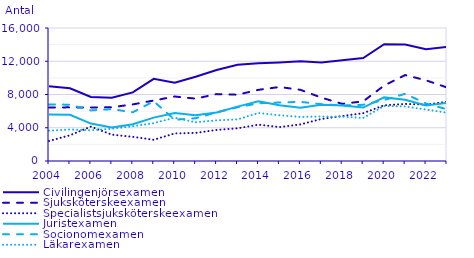
| Category | Civilingenjörsexamen                               | Sjuksköterskeexamen                                | Specialistsjuksköterskeexamen                      | Juristexamen                                       | Socionomexamen                                     | Läkarexamen                                        |
|---|---|---|---|---|---|---|
| 2004.0 | 8998 | 6431 | 2407 | 5599 | 6807 | 3650 |
| 2005.0 | 8755 | 6456 | 3095 | 5560 | 6772 | 3788 |
| 2006.0 | 7711 | 6438 | 4136 | 4499 | 6085 | 3698 |
| 2007.0 | 7616 | 6466 | 3169 | 4042 | 6238 | 3878 |
| 2008.0 | 8249 | 6808 | 2906 | 4432 | 5862 | 4187 |
| 2009.0 | 9889 | 7276 | 2551 | 5218 | 7181 | 4548 |
| 2010.0 | 9407 | 7757 | 3318 | 5769 | 4960 | 5206 |
| 2011.0 | 10127 | 7504 | 3378 | 5497 | 5147 | 4658 |
| 2012.0 | 10948 | 8047 | 3739 | 5826 | 5844 | 4895 |
| 2013.0 | 11568 | 7976 | 3931 | 6543 | 6465 | 5006 |
| 2014.0 | 11750 | 8562 | 4374 | 7174 | 6945 | 5772 |
| 2015.0 | 11848 | 8902 | 4081 | 6715 | 7035 | 5499 |
| 2016.0 | 11992 | 8565 | 4401 | 6417 | 7119 | 5305 |
| 2017.0 | 11843 | 7629 | 5056 | 6774 | 6837 | 5353 |
| 2018.0 | 12129 | 6875 | 5408 | 6686 | 6675 | 5328 |
| 2019.0 | 12392 | 7178 | 5754 | 6425 | 6759 | 5176 |
| 2020.0 | 14042 | 9079 | 6703 | 7652 | 7336 | 6613 |
| 2021.0 | 14012 | 10337 | 6865 | 7376 | 8086 | 6567 |
| 2022.0 | 13432 | 9707 | 6783 | 6672 | 6911 | 6193 |
| 2023.0 | 13725 | 8846 | 7127 | 6978 | 6221 | 5804 |